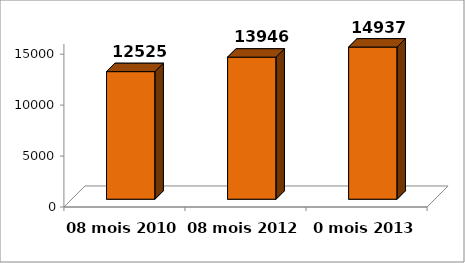
| Category | Series 0 |
|---|---|
| 08 mois 2010 | 12524.8 |
| 08 mois 2012 | 13946.228 |
| 0 mois 2013 | 14937.266 |